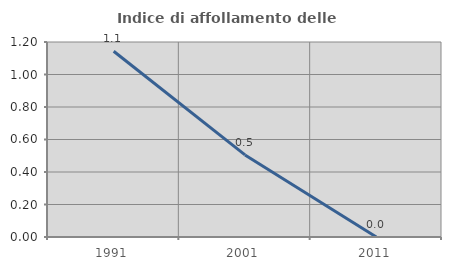
| Category | Indice di affollamento delle abitazioni  |
|---|---|
| 1991.0 | 1.143 |
| 2001.0 | 0.505 |
| 2011.0 | 0 |